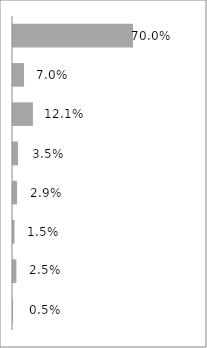
| Category | Series 0 |
|---|---|
| Excel School - Dashboards Membership | 0.7 |
| PM Templates for Excel [2007] | 0.07 |
| Excel School - Download Membership | 0.121 |
| Dashboard Tutorial #1 | 0.035 |
| PM Templates for Excel [both] | 0.029 |
| PM Templates for Excel [2003] | 0.015 |
| Excel School - Online Membership | 0.025 |
| Excel Formula e-book | 0.005 |